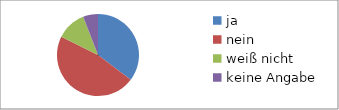
| Category | Series 0 |
|---|---|
| ja | 6 |
| nein | 8 |
| weiß nicht | 2 |
| keine Angabe | 1 |